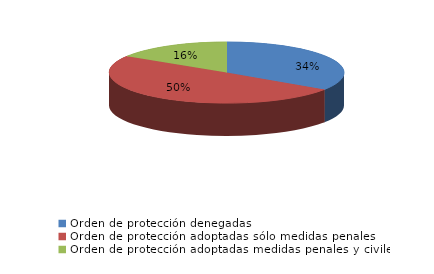
| Category | Series 0 |
|---|---|
| Orden de protección denegadas | 139 |
| Orden de protección adoptadas sólo medidas penales | 201 |
| Orden de protección adoptadas medidas penales y civiles | 65 |